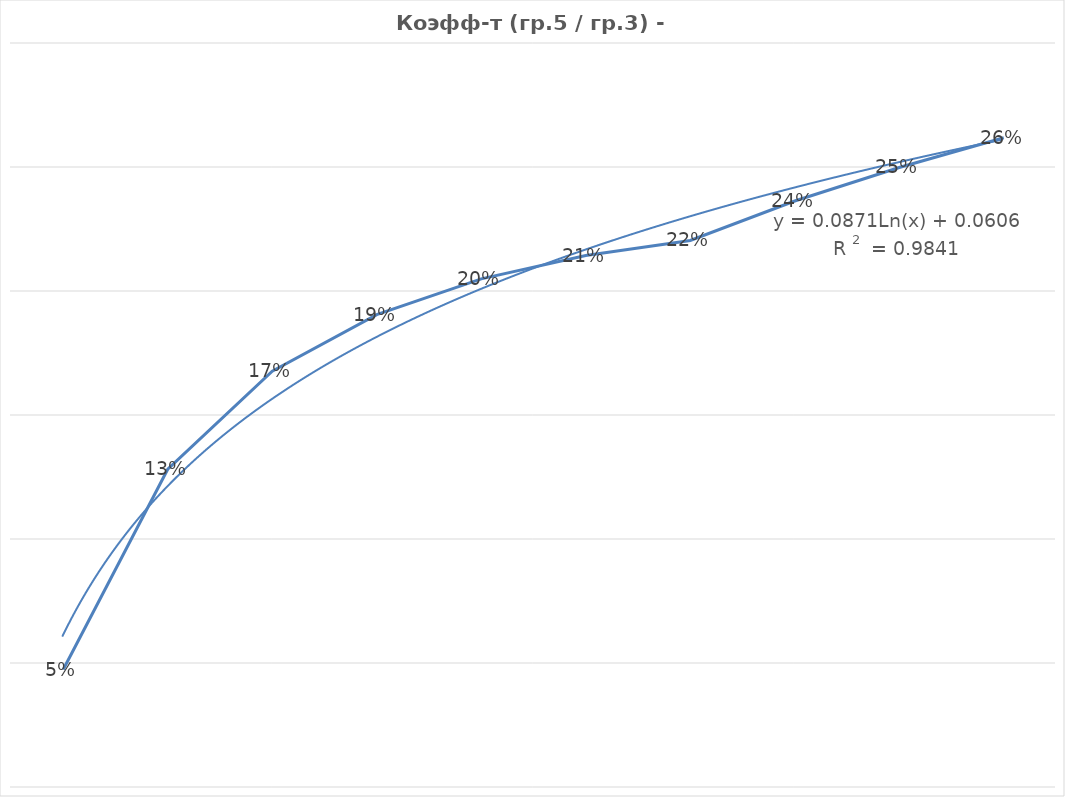
| Category | Series 0 |
|---|---|
| 0 | 0.047 |
| 1 | 0.128 |
| 2 | 0.168 |
| 3 | 0.19 |
| 4 | 0.205 |
| 5 | 0.214 |
| 6 | 0.22 |
| 7 | 0.236 |
| 8 | 0.25 |
| 9 | 0.262 |